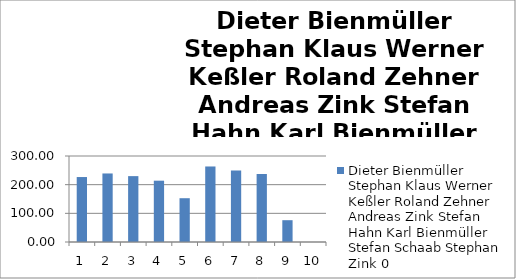
| Category | Dieter Bienmüller Stephan Klaus Werner Keßler Roland Zehner Andreas Zink Stefan Hahn Karl Bienmüller Stefan Schaab Stephan Zink 0 |
|---|---|
| 0 | 226.62 |
| 1 | 239.07 |
| 2 | 229.8 |
| 3 | 213.91 |
| 4 | 152.76 |
| 5 | 263.45 |
| 6 | 249.44 |
| 7 | 237.28 |
| 8 | 76.06 |
| 9 | 0 |